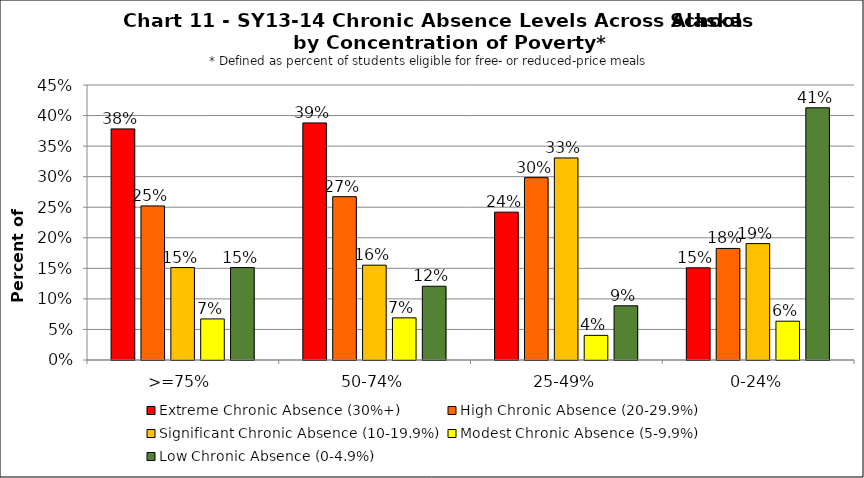
| Category | Extreme Chronic Absence (30%+) | High Chronic Absence (20-29.9%) | Significant Chronic Absence (10-19.9%) | Modest Chronic Absence (5-9.9%) | Low Chronic Absence (0-4.9%) |
|---|---|---|---|---|---|
| 0 | 0.378 | 0.252 | 0.151 | 0.067 | 0.151 |
| 1 | 0.388 | 0.267 | 0.155 | 0.069 | 0.121 |
| 2 | 0.242 | 0.298 | 0.331 | 0.04 | 0.089 |
| 3 | 0.151 | 0.183 | 0.19 | 0.063 | 0.413 |